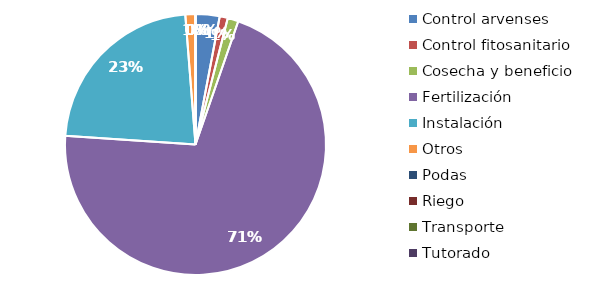
| Category | Valor |
|---|---|
| Control arvenses | 483550 |
| Control fitosanitario | 163365 |
| Cosecha y beneficio | 216735.796 |
| Fertilización | 11492152 |
| Instalación | 3686991.966 |
| Otros | 203200 |
| Podas | 0 |
| Riego | 0 |
| Transporte | 0 |
| Tutorado | 0 |